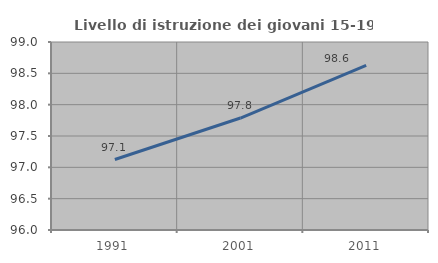
| Category | Livello di istruzione dei giovani 15-19 anni |
|---|---|
| 1991.0 | 97.125 |
| 2001.0 | 97.787 |
| 2011.0 | 98.627 |